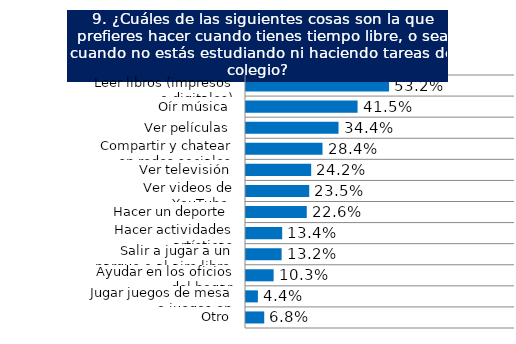
| Category | Series 0 |
|---|---|
| Leer libros (impresos o digitales) | 0.532 |
| Oír música | 0.415 |
| Ver películas | 0.344 |
| Compartir y chatear en redes sociales | 0.284 |
| Ver televisión | 0.242 |
| Ver videos de YouTube  | 0.235 |
| Hacer un deporte | 0.226 |
| Hacer actividades artísticas | 0.134 |
| Salir a jugar a un parque o al aire libre | 0.132 |
| Ayudar en los oficios del hogar | 0.103 |
| Jugar juegos de mesa o juegos en | 0.044 |
| Otro | 0.068 |